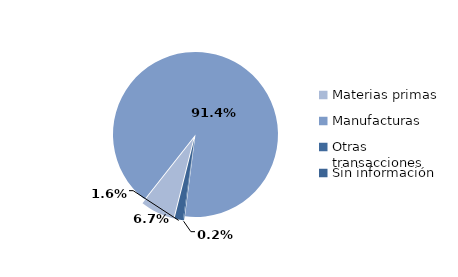
| Category | Series 0 |
|---|---|
| Materias primas | 680.804 |
| Manufacturas | 9264.42 |
| Otras transacciones | 22.284 |
| Sin información | 166.447 |